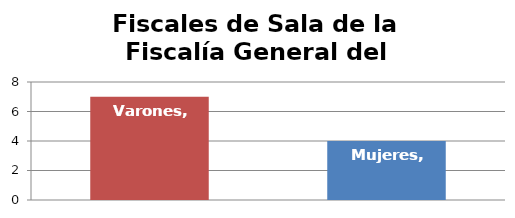
| Category | Fiscales de Sala de la Fiscalía General del Estado |
|---|---|
| Varones | 7 |
| Mujeres | 4 |